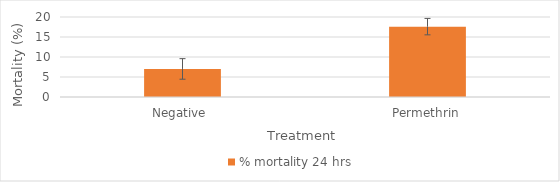
| Category | % mortality 24 hrs |
|---|---|
| Negative  | 7.018 |
| Permethrin | 17.593 |